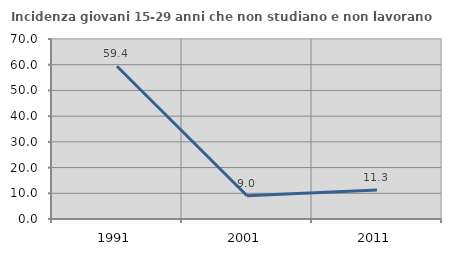
| Category | Incidenza giovani 15-29 anni che non studiano e non lavorano  |
|---|---|
| 1991.0 | 59.42 |
| 2001.0 | 9.028 |
| 2011.0 | 11.273 |